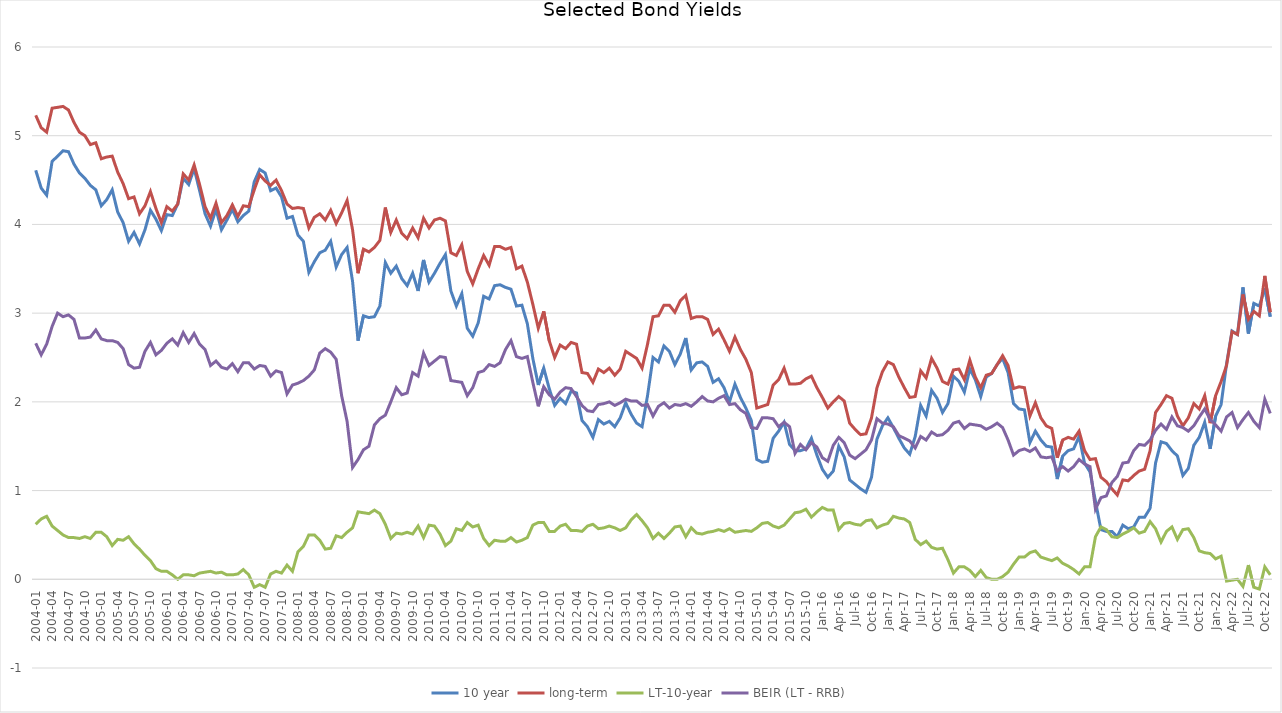
| Category | 10 year | long-term | LT-10-year | BEIR (LT - RRB) |
|---|---|---|---|---|
| 2004-01 | 4.61 | 5.23 | 0.62 | 2.66 |
| 2004-02 | 4.41 | 5.09 | 0.68 | 2.53 |
| 2004-03 | 4.33 | 5.04 | 0.71 | 2.65 |
| 2004-04 | 4.71 | 5.31 | 0.6 | 2.85 |
| 2004-05 | 4.77 | 5.32 | 0.55 | 3 |
| 2004-06 | 4.83 | 5.33 | 0.5 | 2.96 |
| 2004-07 | 4.82 | 5.29 | 0.47 | 2.98 |
| 2004-08 | 4.68 | 5.15 | 0.47 | 2.93 |
| 2004-09 | 4.58 | 5.04 | 0.46 | 2.72 |
| 2004-10 | 4.52 | 5 | 0.48 | 2.72 |
| 2004-11 | 4.44 | 4.9 | 0.46 | 2.73 |
| 2004-12 | 4.39 | 4.92 | 0.53 | 2.81 |
| 2005-01 | 4.21 | 4.74 | 0.53 | 2.71 |
| 2005-02 | 4.28 | 4.76 | 0.48 | 2.69 |
| 2005-03 | 4.39 | 4.77 | 0.38 | 2.69 |
| 2005-04 | 4.14 | 4.59 | 0.45 | 2.67 |
| 2005-05 | 4.02 | 4.46 | 0.44 | 2.6 |
| 2005-06 | 3.81 | 4.29 | 0.48 | 2.42 |
| 2005-07 | 3.91 | 4.31 | 0.4 | 2.38 |
| 2005-08 | 3.78 | 4.12 | 0.34 | 2.39 |
| 2005-09 | 3.94 | 4.21 | 0.27 | 2.57 |
| 2005-10 | 4.16 | 4.37 | 0.21 | 2.67 |
| 2005-11 | 4.06 | 4.18 | 0.12 | 2.53 |
| 2005-12 | 3.93 | 4.02 | 0.09 | 2.58 |
| 2006-01 | 4.11 | 4.2 | 0.09 | 2.66 |
| 2006-02 | 4.1 | 4.15 | 0.05 | 2.71 |
| 2006-03 | 4.23 | 4.23 | 0 | 2.64 |
| 2006-04 | 4.52 | 4.57 | 0.05 | 2.78 |
| 2006-05 | 4.45 | 4.5 | 0.05 | 2.67 |
| 2006-06 | 4.63 | 4.67 | 0.04 | 2.77 |
| 2006-07 | 4.38 | 4.45 | 0.07 | 2.65 |
| 2006-08 | 4.12 | 4.2 | 0.08 | 2.59 |
| 2006-09 | 3.98 | 4.07 | 0.09 | 2.41 |
| 2006-10 | 4.17 | 4.24 | 0.07 | 2.46 |
| 2006-11 | 3.94 | 4.02 | 0.08 | 2.39 |
| 2006-12 | 4.05 | 4.1 | 0.05 | 2.37 |
| 2007-01 | 4.17 | 4.22 | 0.05 | 2.43 |
| 2007-02 | 4.03 | 4.09 | 0.06 | 2.34 |
| 2007-03 | 4.1 | 4.21 | 0.11 | 2.44 |
| 2007-04 | 4.15 | 4.2 | 0.05 | 2.44 |
| 2007-05 | 4.48 | 4.39 | -0.09 | 2.37 |
| 2007-06 | 4.62 | 4.56 | -0.06 | 2.41 |
| 2007-07 | 4.58 | 4.49 | -0.09 | 2.4 |
| 2007-08 | 4.38 | 4.44 | 0.06 | 2.29 |
| 2007-09 | 4.41 | 4.5 | 0.09 | 2.35 |
| 2007-10 | 4.31 | 4.38 | 0.07 | 2.33 |
| 2007-11 | 4.07 | 4.23 | 0.16 | 2.09 |
| 2007-12 | 4.09 | 4.18 | 0.09 | 2.19 |
| 2008-01 | 3.88 | 4.19 | 0.31 | 2.21 |
| 2008-02 | 3.81 | 4.18 | 0.37 | 2.24 |
| 2008-03 | 3.46 | 3.96 | 0.5 | 2.29 |
| 2008-04 | 3.58 | 4.08 | 0.5 | 2.36 |
| 2008-05 | 3.68 | 4.12 | 0.44 | 2.55 |
| 2008-06 | 3.71 | 4.05 | 0.34 | 2.6 |
| 2008-07 | 3.81 | 4.16 | 0.35 | 2.56 |
| 2008-08 | 3.52 | 4.01 | 0.49 | 2.48 |
| 2008-09 | 3.66 | 4.13 | 0.47 | 2.07 |
| 2008-10 | 3.74 | 4.27 | 0.53 | 1.78 |
| 2008-11 | 3.36 | 3.94 | 0.58 | 1.26 |
| 2008-12 | 2.69 | 3.45 | 0.76 | 1.35 |
| 2009-01 | 2.97 | 3.72 | 0.75 | 1.46 |
| 2009-02 | 2.95 | 3.69 | 0.74 | 1.5 |
| 2009-03 | 2.96 | 3.74 | 0.78 | 1.74 |
| 2009-04 | 3.08 | 3.82 | 0.74 | 1.81 |
| 2009-05 | 3.57 | 4.19 | 0.62 | 1.85 |
| 2009-06 | 3.45 | 3.91 | 0.46 | 2 |
| 2009-07 | 3.53 | 4.05 | 0.52 | 2.16 |
| 2009-08 | 3.39 | 3.9 | 0.51 | 2.08 |
| 2009-09 | 3.31 | 3.84 | 0.53 | 2.1 |
| 2009-10 | 3.45 | 3.96 | 0.51 | 2.33 |
| 2009-11 | 3.25 | 3.85 | 0.6 | 2.29 |
| 2009-12 | 3.6 | 4.07 | 0.47 | 2.55 |
| 2010-01 | 3.35 | 3.96 | 0.61 | 2.41 |
| 2010-02 | 3.45 | 4.05 | 0.6 | 2.46 |
| 2010-03 | 3.56 | 4.07 | 0.51 | 2.51 |
| 2010-04 | 3.66 | 4.04 | 0.38 | 2.5 |
| 2010-05 | 3.25 | 3.68 | 0.43 | 2.24 |
| 2010-06 | 3.08 | 3.65 | 0.57 | 2.23 |
| 2010-07 | 3.22 | 3.77 | 0.55 | 2.22 |
| 2010-08 | 2.83 | 3.47 | 0.64 | 2.07 |
| 2010-09 | 2.74 | 3.33 | 0.59 | 2.16 |
| 2010-10 | 2.89 | 3.5 | 0.61 | 2.33 |
| 2010-11 | 3.19 | 3.65 | 0.46 | 2.35 |
| 2010-12 | 3.16 | 3.54 | 0.38 | 2.42 |
| 2011-01 | 3.31 | 3.75 | 0.44 | 2.4 |
| 2011-02 | 3.32 | 3.75 | 0.43 | 2.44 |
| 2011-03 | 3.29 | 3.72 | 0.43 | 2.59 |
| 2011-04 | 3.27 | 3.74 | 0.47 | 2.69 |
| 2011-05 | 3.08 | 3.5 | 0.42 | 2.51 |
| 2011-06 | 3.09 | 3.53 | 0.44 | 2.49 |
| 2011-07 | 2.88 | 3.35 | 0.47 | 2.51 |
| 2011-08 | 2.49 | 3.1 | 0.61 | 2.22 |
| 2011-09 | 2.19 | 2.83 | 0.64 | 1.95 |
| 2011-10 | 2.38 | 3.02 | 0.64 | 2.17 |
| 2011-11 | 2.15 | 2.69 | 0.54 | 2.08 |
| 2011-12 | 1.96 | 2.5 | 0.54 | 2.03 |
| 2012-01 | 2.04 | 2.64 | 0.6 | 2.11 |
| 2012-02 | 1.98 | 2.6 | 0.62 | 2.16 |
| 2012-03 | 2.12 | 2.67 | 0.55 | 2.15 |
| 2012-04 | 2.1 | 2.65 | 0.55 | 2.06 |
| 2012-05 | 1.79 | 2.33 | 0.54 | 1.96 |
| 2012-06 | 1.72 | 2.32 | 0.6 | 1.9 |
| 2012-07 | 1.6 | 2.22 | 0.62 | 1.89 |
| 2012-08 | 1.8 | 2.37 | 0.57 | 1.97 |
| 2012-09 | 1.75 | 2.33 | 0.58 | 1.98 |
| 2012-10 | 1.78 | 2.38 | 0.6 | 2 |
| 2012-11 | 1.72 | 2.3 | 0.58 | 1.96 |
| 2012-12 | 1.82 | 2.37 | 0.55 | 1.99 |
| 2013-01 | 1.99 | 2.57 | 0.58 | 2.03 |
| 2013-02 | 1.86 | 2.53 | 0.67 | 2.01 |
| 2013-03 | 1.76 | 2.49 | 0.73 | 2.01 |
| 2013-04 | 1.72 | 2.38 | 0.66 | 1.96 |
| 2013-05 | 2.07 | 2.65 | 0.58 | 1.97 |
| 2013-06 | 2.5 | 2.96 | 0.46 | 1.84 |
| 2013-07 | 2.45 | 2.97 | 0.52 | 1.95 |
| 2013-08 | 2.63 | 3.09 | 0.46 | 1.99 |
| 2013-09 | 2.57 | 3.09 | 0.52 | 1.93 |
| 2013-10 | 2.42 | 3.01 | 0.59 | 1.97 |
| 2013-11 | 2.54 | 3.14 | 0.6 | 1.96 |
| 2013-12 | 2.72 | 3.2 | 0.48 | 1.98 |
| 2014-01 | 2.36 | 2.94 | 0.58 | 1.95 |
| 2014-02 | 2.44 | 2.96 | 0.52 | 2 |
| 2014-03 | 2.45 | 2.96 | 0.51 | 2.06 |
| 2014-04 | 2.4 | 2.93 | 0.53 | 2.01 |
| 2014-05 | 2.22 | 2.76 | 0.54 | 2 |
| 2014-06 | 2.26 | 2.82 | 0.56 | 2.04 |
| 2014-07 | 2.16 | 2.7 | 0.54 | 2.07 |
| 2014-08 | 2 | 2.57 | 0.57 | 1.97 |
| 2014-09 | 2.2 | 2.73 | 0.53 | 1.98 |
| 2014-10 | 2.05 | 2.59 | 0.54 | 1.91 |
| 2014-11 | 1.93 | 2.48 | 0.55 | 1.87 |
| 2014-12 | 1.79 | 2.33 | 0.54 | 1.71 |
| 2015-01 | 1.35 | 1.93 | 0.58 | 1.7 |
| 2015-02 | 1.32 | 1.95 | 0.63 | 1.82 |
| 2015-03 | 1.33 | 1.97 | 0.64 | 1.82 |
| 2015-04 | 1.59 | 2.19 | 0.6 | 1.81 |
| 2015-05 | 1.67 | 2.25 | 0.58 | 1.72 |
| 2015-06 | 1.77 | 2.38 | 0.61 | 1.77 |
| 2015-07 | 1.52 | 2.2 | 0.68 | 1.72 |
| 2015-08 | 1.45 | 2.2 | 0.75 | 1.42 |
| 2015-09 | 1.45 | 2.21 | 0.76 | 1.52 |
| 2015-10 | 1.47 | 2.26 | 0.79 | 1.46 |
| 2015-11 | 1.59 | 2.29 | 0.7 | 1.54 |
| 2015-12 | 1.4 | 2.16 | 0.76 | 1.49 |
| Jan-16 | 1.24 | 2.05 | 0.81 | 1.37 |
| Feb-16 | 1.15 | 1.93 | 0.78 | 1.33 |
| Mar-16 | 1.22 | 2 | 0.78 | 1.51 |
| Apr-16 | 1.5 | 2.06 | 0.56 | 1.6 |
| May-16 | 1.38 | 2.01 | 0.63 | 1.54 |
| Jun-16 | 1.12 | 1.76 | 0.64 | 1.4 |
| Jul-16 | 1.07 | 1.69 | 0.62 | 1.36 |
| Aug-16 | 1.02 | 1.63 | 0.61 | 1.41 |
| Sep-16 | 0.98 | 1.64 | 0.66 | 1.46 |
| Oct-16 | 1.15 | 1.82 | 0.67 | 1.57 |
| Nov-16 | 1.58 | 2.16 | 0.58 | 1.81 |
| Dec-16 | 1.73 | 2.34 | 0.61 | 1.76 |
| Jan-17 | 1.82 | 2.45 | 0.63 | 1.75 |
| Feb-17 | 1.71 | 2.42 | 0.71 | 1.72 |
| Mar-17 | 1.59 | 2.28 | 0.69 | 1.62 |
| Apr-17 | 1.48 | 2.16 | 0.68 | 1.59 |
| May-17 | 1.41 | 2.05 | 0.64 | 1.56 |
| Jun-17 | 1.61 | 2.06 | 0.45 | 1.48 |
| Jul-17 | 1.96 | 2.35 | 0.39 | 1.61 |
| Aug-17 | 1.84 | 2.27 | 0.43 | 1.57 |
| Sep-17 | 2.13 | 2.49 | 0.36 | 1.66 |
| Oct-17 | 2.04 | 2.38 | 0.34 | 1.62 |
| Nov-17 | 1.88 | 2.23 | 0.35 | 1.63 |
| Dec-17 | 1.98 | 2.2 | 0.22 | 1.68 |
| Jan-18 | 2.29 | 2.36 | 0.07 | 1.76 |
| Feb-18 | 2.23 | 2.37 | 0.14 | 1.78 |
| Mar-18 | 2.11 | 2.25 | 0.14 | 1.7 |
| Apr-18 | 2.37 | 2.47 | 0.1 | 1.75 |
| May-18 | 2.25 | 2.28 | 0.03 | 1.74 |
| Jun-18 | 2.06 | 2.16 | 0.1 | 1.73 |
| Jul-18 | 2.28 | 2.3 | 0.02 | 1.69 |
| Aug-18 | 2.32 | 2.32 | 0 | 1.72 |
| Sep-18 | 2.42 | 2.42 | 0 | 1.76 |
| Oct-18 | 2.49 | 2.52 | 0.03 | 1.71 |
| Nov-18 | 2.33 | 2.41 | 0.08 | 1.57 |
| Dec-18 | 1.98 | 2.15 | 0.17 | 1.4 |
| Jan-19 | 1.92 | 2.17 | 0.25 | 1.45 |
| Feb-19 | 1.91 | 2.16 | 0.25 | 1.47 |
| Mar-19 | 1.54 | 1.84 | 0.3 | 1.44 |
| Apr-19 | 1.67 | 1.99 | 0.32 | 1.48 |
| May-19 | 1.57 | 1.82 | 0.25 | 1.38 |
| Jun-19 | 1.5 | 1.73 | 0.23 | 1.37 |
| Jul-19 | 1.49 | 1.7 | 0.21 | 1.38 |
| Aug-19 | 1.13 | 1.37 | 0.24 | 1.22 |
| Sep-19 | 1.39 | 1.57 | 0.18 | 1.27 |
| Oct-19 | 1.45 | 1.6 | 0.15 | 1.22 |
| Nov-19 | 1.47 | 1.58 | 0.11 | 1.27 |
| Dec-19 | 1.61 | 1.67 | 0.06 | 1.35 |
| Jan-20 | 1.31 | 1.45 | 0.14 | 1.3 |
| Feb-20 | 1.21 | 1.35 | 0.14 | 1.27 |
| Mar-20 | 0.88 | 1.36 | 0.48 | 0.79 |
| Apr-20 | 0.56 | 1.15 | 0.59 | 0.92 |
| May-20 | 0.54 | 1.1 | 0.56 | 0.94 |
| Jun-20 | 0.54 | 1.02 | 0.48 | 1.09 |
| Jul-20 | 0.48 | 0.95 | 0.47 | 1.16 |
| Aug-20 | 0.61 | 1.12 | 0.51 | 1.31 |
| Sep-20 | 0.57 | 1.11 | 0.54 | 1.32 |
| Oct-20 | 0.59 | 1.17 | 0.58 | 1.45 |
| Nov-20 | 0.7 | 1.22 | 0.52 | 1.52 |
| Dec-20 | 0.7 | 1.24 | 0.54 | 1.51 |
| Jan-21 | 0.8 | 1.45 | 0.65 | 1.57 |
| Feb-21 | 1.31 | 1.88 | 0.57 | 1.68 |
| Mar-21 | 1.55 | 1.97 | 0.42 | 1.75 |
| Apr-21 | 1.53 | 2.07 | 0.54 | 1.69 |
| May-21 | 1.45 | 2.04 | 0.59 | 1.83 |
| Jun-21 | 1.39 | 1.84 | 0.45 | 1.73 |
| Jul-21 | 1.17 | 1.73 | 0.56 | 1.71 |
| Aug-21 | 1.25 | 1.82 | 0.57 | 1.67 |
| Sep-21 | 1.51 | 1.98 | 0.47 | 1.73 |
| Oct-21 | 1.6 | 1.92 | 0.32 | 1.83 |
| Nov-21 | 1.77 | 2.07 | 0.3 | 1.92 |
| Dec-21 | 1.47 | 1.76 | 0.29 | 1.8 |
| Jan-22 | 1.84 | 2.07 | 0.23 | 1.74 |
| Feb-22 | 1.97 | 2.23 | 0.26 | 1.67 |
| Mar-22 | 2.43 | 2.41 | -0.02 | 1.83 |
| Apr-22 | 2.8 | 2.79 | -0.01 | 1.88 |
| May-22 | 2.76 | 2.76 | 0 | 1.71 |
| Jun-22 | 3.29 | 3.21 | -0.08 | 1.8 |
| Jul-22 | 2.77 | 2.93 | 0.16 | 1.88 |
| Aug-22 | 3.11 | 3.02 | -0.09 | 1.78 |
| Sep-22 | 3.08 | 2.97 | -0.11 | 1.71 |
| Oct-22 | 3.28 | 3.42 | 0.14 | 2.03 |
| Nov-22 | 2.96 | 3.01 | 0.05 | 1.87 |